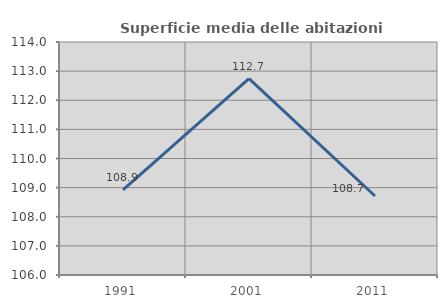
| Category | Superficie media delle abitazioni occupate |
|---|---|
| 1991.0 | 108.926 |
| 2001.0 | 112.744 |
| 2011.0 | 108.712 |